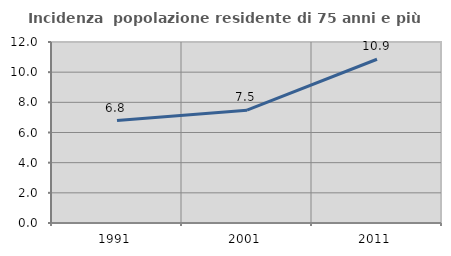
| Category | Incidenza  popolazione residente di 75 anni e più |
|---|---|
| 1991.0 | 6.792 |
| 2001.0 | 7.479 |
| 2011.0 | 10.855 |